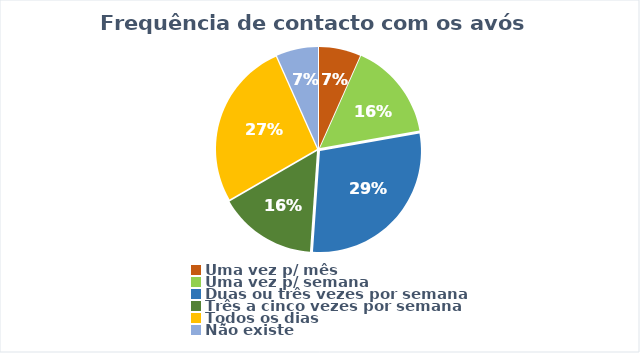
| Category | Series 0 |
|---|---|
| Uma vez p/ mês | 3 |
| Uma vez p/ semana | 7 |
| Duas ou três vezes por semana | 13 |
| Três a cinco vezes por semana | 7 |
| Todos os dias | 12 |
| Não existe | 3 |